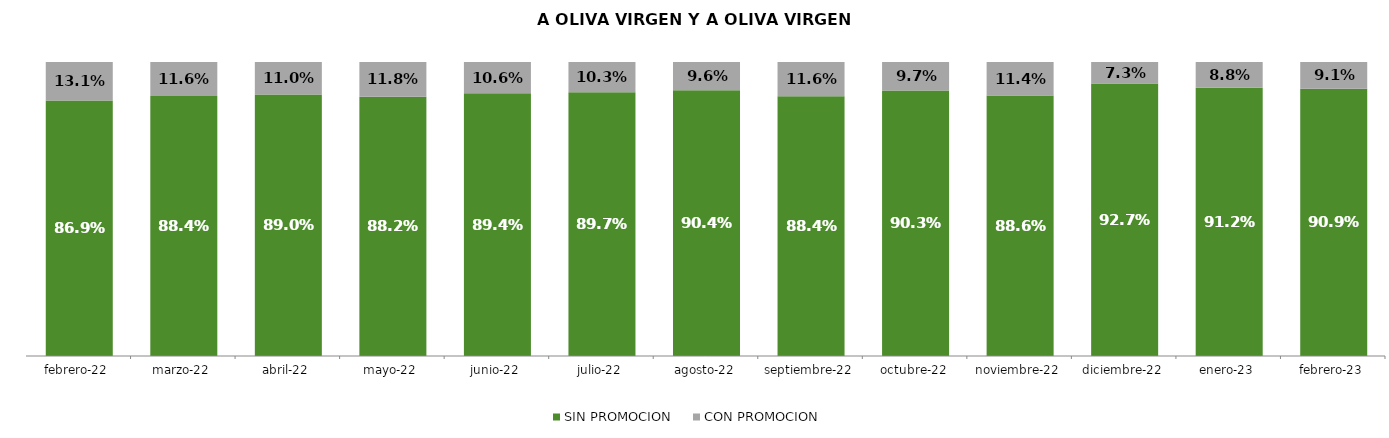
| Category | SIN PROMOCION   | CON PROMOCION   |
|---|---|---|
| 2022-02-01 | 0.869 | 0.131 |
| 2022-03-01 | 0.884 | 0.116 |
| 2022-04-01 | 0.89 | 0.11 |
| 2022-05-01 | 0.882 | 0.118 |
| 2022-06-01 | 0.894 | 0.106 |
| 2022-07-01 | 0.897 | 0.103 |
| 2022-08-01 | 0.904 | 0.096 |
| 2022-09-01 | 0.884 | 0.116 |
| 2022-10-01 | 0.903 | 0.097 |
| 2022-11-01 | 0.886 | 0.114 |
| 2022-12-01 | 0.927 | 0.073 |
| 2023-01-01 | 0.912 | 0.088 |
| 2023-02-01 | 0.909 | 0.091 |